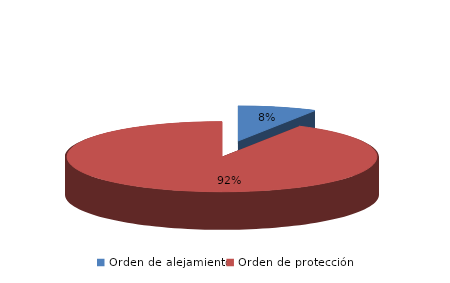
| Category | Series 0 |
|---|---|
| Orden de alejamiento | 8 |
| Orden de protección | 90 |